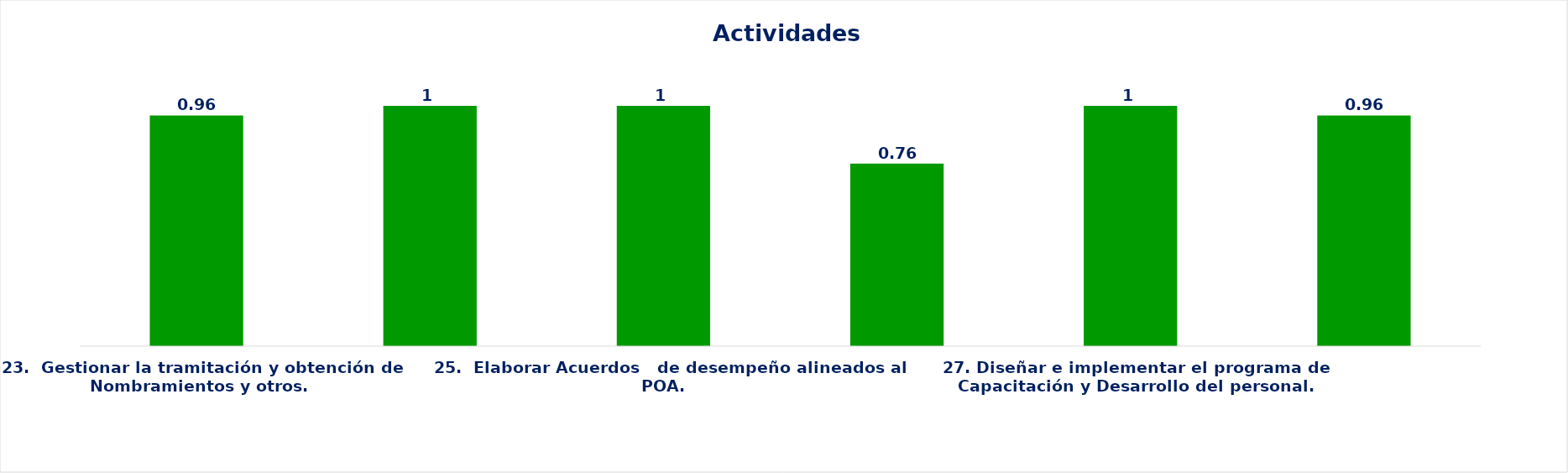
| Category | Series 0 |
|---|---|
| 23.  Gestionar la tramitación y obtención de Nombramientos y otros. | 0.96 |
| 24.  Implementar Programa de Salud, Seguridad Ocupacional y Prevención de Riesgos Laborales en la DGCN. | 1 |
| 25.  Elaborar Acuerdos   de desempeño alineados al POA. | 1 |
| 26. Actualizar  Manual de Cargos de la DGCN. | 0.76 |
| 27. Diseñar e implementar el programa de Capacitación y Desarrollo del personal. | 1 |
| 28. Actualizar el sistema de compensación y beneficios. | 0.96 |